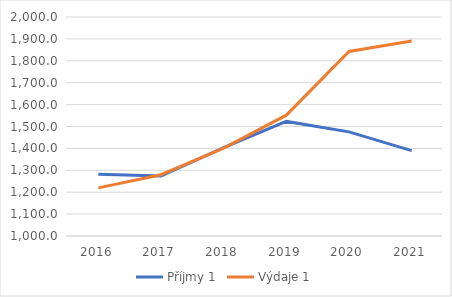
| Category | Příjmy 1 | Výdaje 1 |
|---|---|---|
| 2016.0 | 1281.62 | 1219.84 |
| 2017.0 | 1273.64 | 1279.8 |
| 2018.0 | 1403.92 | 1400.97 |
| 2019.0 | 1523.23 | 1551.74 |
| 2020.0 | 1475.5 | 1842.9 |
| 2021.0 | 1390 | 1890 |